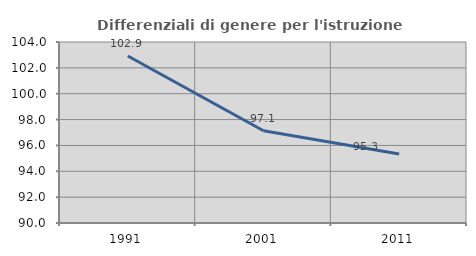
| Category | Differenziali di genere per l'istruzione superiore |
|---|---|
| 1991.0 | 102.92 |
| 2001.0 | 97.137 |
| 2011.0 | 95.341 |